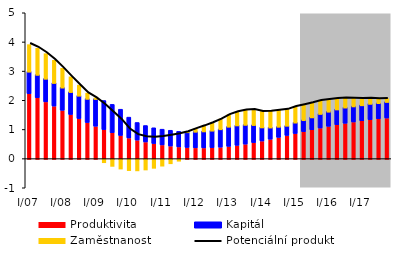
| Category | Produktivita | Kapitál | Zaměstnanost |
|---|---|---|---|
| I/07 | 2.226 | 0.766 | 0.934 |
| II | 2.088 | 0.795 | 0.917 |
| III | 1.946 | 0.803 | 0.867 |
| IV | 1.801 | 0.803 | 0.784 |
| I/08 | 1.656 | 0.79 | 0.669 |
| II | 1.512 | 0.781 | 0.529 |
| III | 1.372 | 0.796 | 0.369 |
| IV | 1.237 | 0.823 | 0.202 |
| I/09 | 1.11 | 0.947 | 0.04 |
| II | 0.993 | 0.999 | -0.11 |
| III | 0.887 | 0.973 | -0.236 |
| IV | 0.792 | 0.902 | -0.328 |
| I/10 | 0.708 | 0.714 | -0.382 |
| II | 0.635 | 0.604 | -0.39 |
| III | 0.571 | 0.564 | -0.36 |
| IV | 0.516 | 0.541 | -0.303 |
| I/11 | 0.469 | 0.54 | -0.229 |
| II | 0.431 | 0.541 | -0.146 |
| III | 0.402 | 0.533 | -0.059 |
| IV | 0.381 | 0.536 | 0.029 |
| I/12 | 0.37 | 0.562 | 0.116 |
| II | 0.367 | 0.577 | 0.201 |
| III | 0.375 | 0.595 | 0.281 |
| IV | 0.392 | 0.627 | 0.355 |
| I/13 | 0.418 | 0.686 | 0.421 |
| II | 0.454 | 0.696 | 0.474 |
| III | 0.497 | 0.672 | 0.512 |
| IV | 0.548 | 0.614 | 0.537 |
| I/14 | 0.604 | 0.477 | 0.553 |
| II | 0.664 | 0.412 | 0.563 |
| III | 0.728 | 0.375 | 0.569 |
| IV | 0.793 | 0.345 | 0.566 |
| I/15 | 0.859 | 0.387 | 0.554 |
| II | 0.924 | 0.406 | 0.532 |
| III | 0.988 | 0.438 | 0.501 |
| IV | 1.049 | 0.494 | 0.462 |
| I/16 | 1.107 | 0.513 | 0.419 |
| II | 1.161 | 0.536 | 0.374 |
| III | 1.211 | 0.55 | 0.328 |
| IV | 1.257 | 0.545 | 0.28 |
| I/17 | 1.298 | 0.543 | 0.234 |
| II | 1.334 | 0.555 | 0.191 |
| III | 1.365 | 0.549 | 0.154 |
| IV | 1.391 | 0.562 | 0.124 |